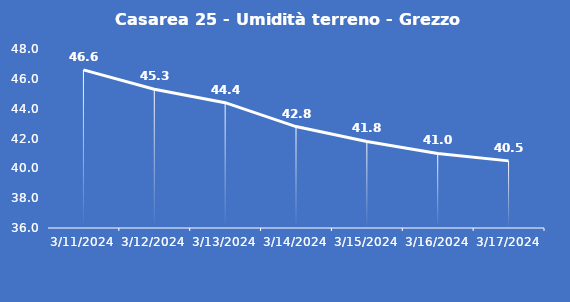
| Category | Casarea 25 - Umidità terreno - Grezzo (%VWC) |
|---|---|
| 3/11/24 | 46.6 |
| 3/12/24 | 45.3 |
| 3/13/24 | 44.4 |
| 3/14/24 | 42.8 |
| 3/15/24 | 41.8 |
| 3/16/24 | 41 |
| 3/17/24 | 40.5 |